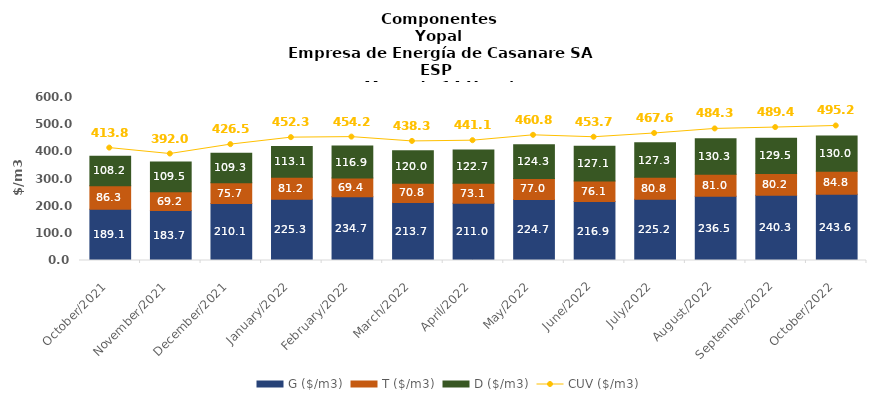
| Category | G ($/m3) | T ($/m3) | D ($/m3) |
|---|---|---|---|
| 2021-10-01 | 189.1 | 86.28 | 108.16 |
| 2021-11-01 | 183.67 | 69.15 | 109.45 |
| 2021-12-01 | 210.1 | 75.73 | 109.33 |
| 2022-01-01 | 225.26 | 81.15 | 113.12 |
| 2022-02-01 | 234.71 | 69.39 | 116.94 |
| 2022-03-01 | 213.68 | 70.77 | 119.98 |
| 2022-04-01 | 210.97 | 73.14 | 122.68 |
| 2022-05-01 | 224.7 | 77.01 | 124.26 |
| 2022-06-01 | 216.91 | 76.08 | 127.14 |
| 2022-07-01 | 225.24 | 80.83 | 127.29 |
| 2022-08-01 | 236.51 | 81 | 130.34 |
| 2022-09-01 | 240.31 | 80.24 | 129.54 |
| 2022-10-01 | 243.58 | 84.76 | 129.96 |